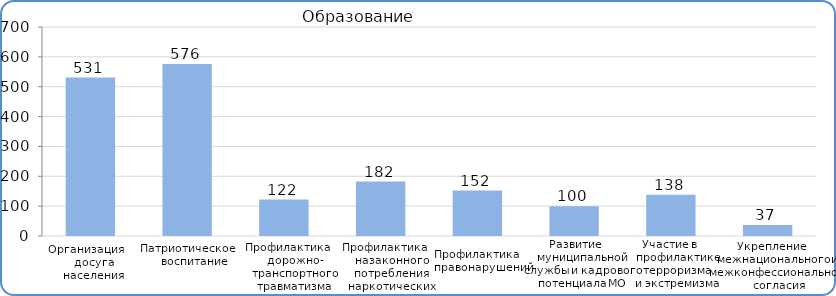
| Category | Расходы |
|---|---|
| Организация досуга населения | 530800 |
| Патриотическое воспитание | 576400 |
| Профилактика дорожно-транспортного травматизма | 122200 |
| Профилактика незаконного потребления наркотических и психотропных веществ | 182200 |
| Профилактика правонарушений | 152200 |
| Развитие и совершенствование муниципальной службы и кадрового потенциала МО | 100000 |
| Участие в профилактике терроризма и экстремизма | 138300 |
| Укрепление межнационального и межконфессионального согласия | 36900 |